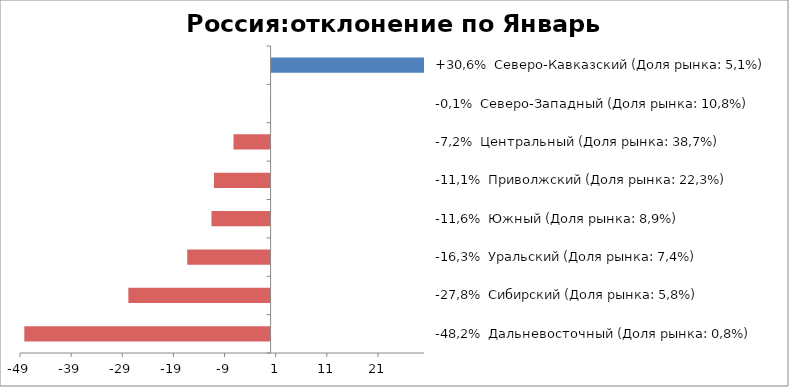
| Category | Россия:отклонение по Январь 2016-2015 |
|---|---|
| -48,2%  Дальневосточный (Доля рынка: 0,8%) | -48.157 |
| -27,8%  Сибирский (Доля рынка: 5,8%) | -27.815 |
| -16,3%  Уральский (Доля рынка: 7,4%) | -16.297 |
| -11,6%  Южный (Доля рынка: 8,9%) | -11.563 |
| -11,1%  Приволжский (Доля рынка: 22,3%) | -11.08 |
| -7,2%  Центральный (Доля рынка: 38,7%) | -7.249 |
| -0,1%  Северо-Западный (Доля рынка: 10,8%) | -0.092 |
| +30,6%  Северо-Кавказский (Доля рынка: 5,1%) | 30.57 |